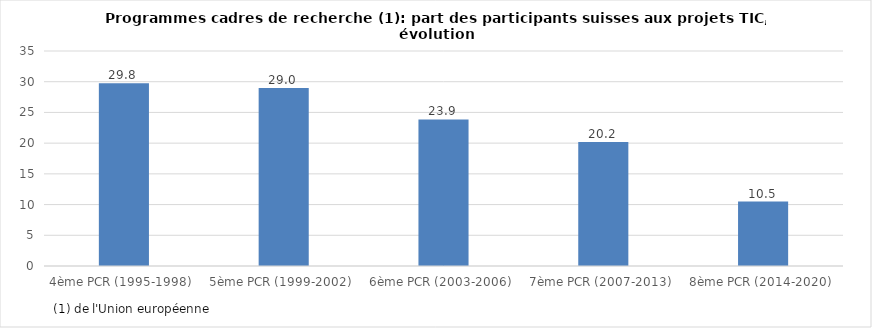
| Category | Series 0 |
|---|---|
| 4ème PCR (1995-1998)  | 29.759 |
| 5ème PCR (1999-2002)  | 28.988 |
| 6ème PCR (2003-2006)  | 23.852 |
| 7ème PCR (2007-2013)  | 20.196 |
| 8ème PCR (2014-2020)  | 10.497 |